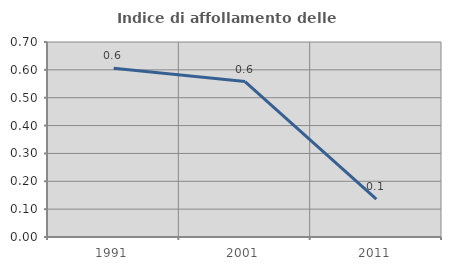
| Category | Indice di affollamento delle abitazioni  |
|---|---|
| 1991.0 | 0.606 |
| 2001.0 | 0.558 |
| 2011.0 | 0.136 |